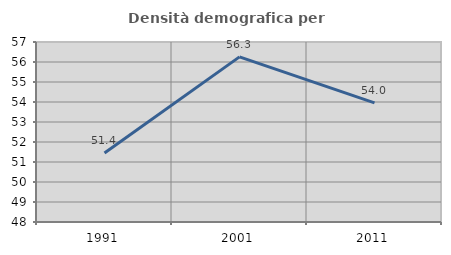
| Category | Densità demografica |
|---|---|
| 1991.0 | 51.447 |
| 2001.0 | 56.257 |
| 2011.0 | 53.957 |